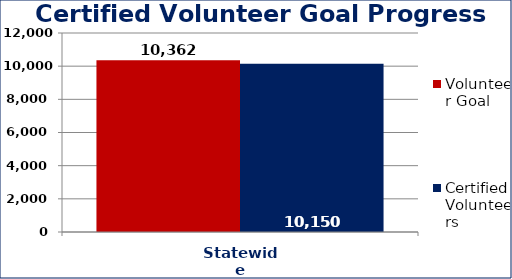
| Category | Volunteer Goal  | Certified Volunteers  |
|---|---|---|
| Statewide | 10362 | 10150 |